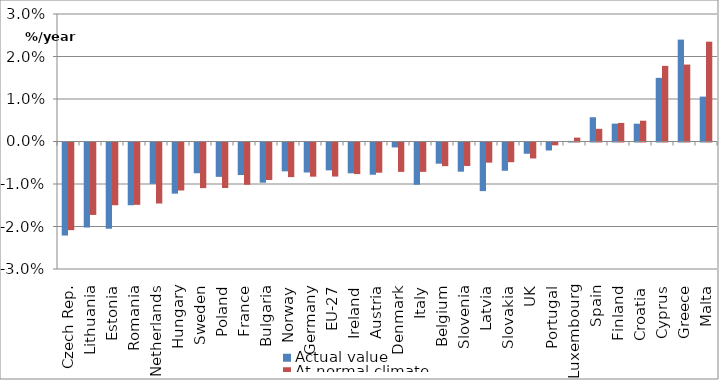
| Category | Actual value | At normal climate |
|---|---|---|
| Czech Rep. | -0.022 | -0.021 |
| Lithuania | -0.02 | -0.017 |
| Estonia | -0.02 | -0.015 |
| Romania | -0.015 | -0.015 |
| Netherlands | -0.01 | -0.014 |
| Hungary | -0.012 | -0.011 |
| Sweden | -0.007 | -0.011 |
| Poland | -0.008 | -0.011 |
| France | -0.008 | -0.01 |
| Bulgaria | -0.009 | -0.009 |
| Norway | -0.007 | -0.008 |
| Germany | -0.007 | -0.008 |
| EU-27 | -0.007 | -0.008 |
| Ireland | -0.007 | -0.007 |
| Austria | -0.008 | -0.007 |
| Denmark | -0.001 | -0.007 |
| Italy | -0.01 | -0.007 |
| Belgium | -0.005 | -0.006 |
| Slovenia | -0.007 | -0.006 |
| Latvia | -0.011 | -0.005 |
| Slovakia | -0.007 | -0.005 |
| UK | -0.003 | -0.004 |
| Portugal | -0.002 | -0.001 |
| Luxembourg | 0 | 0.001 |
| Spain | 0.006 | 0.003 |
| Finland | 0.004 | 0.004 |
| Croatia | 0.004 | 0.005 |
| Cyprus | 0.015 | 0.018 |
| Greece | 0.024 | 0.018 |
| Malta | 0.011 | 0.023 |